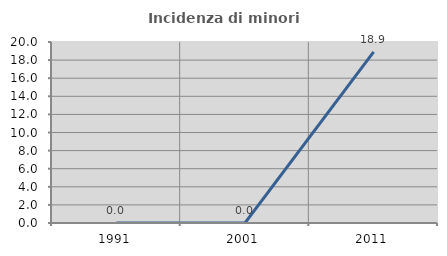
| Category | Incidenza di minori stranieri |
|---|---|
| 1991.0 | 0 |
| 2001.0 | 0 |
| 2011.0 | 18.919 |